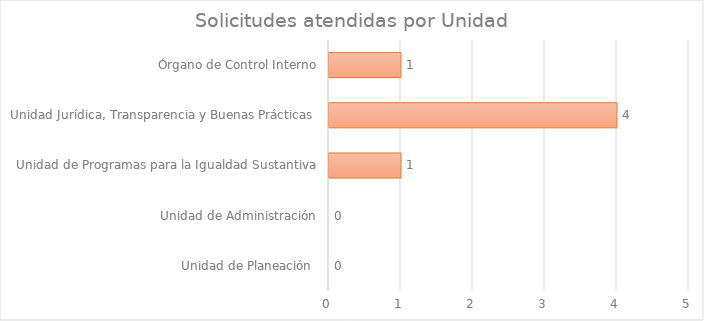
| Category | Series 1 |
|---|---|
| Unidad de Planeación  | 0 |
| Unidad de Administración | 0 |
| Unidad de Programas para la Igualdad Sustantiva | 1 |
| Unidad Jurídica, Transparencia y Buenas Prácticas  | 4 |
| Órgano de Control Interno | 1 |